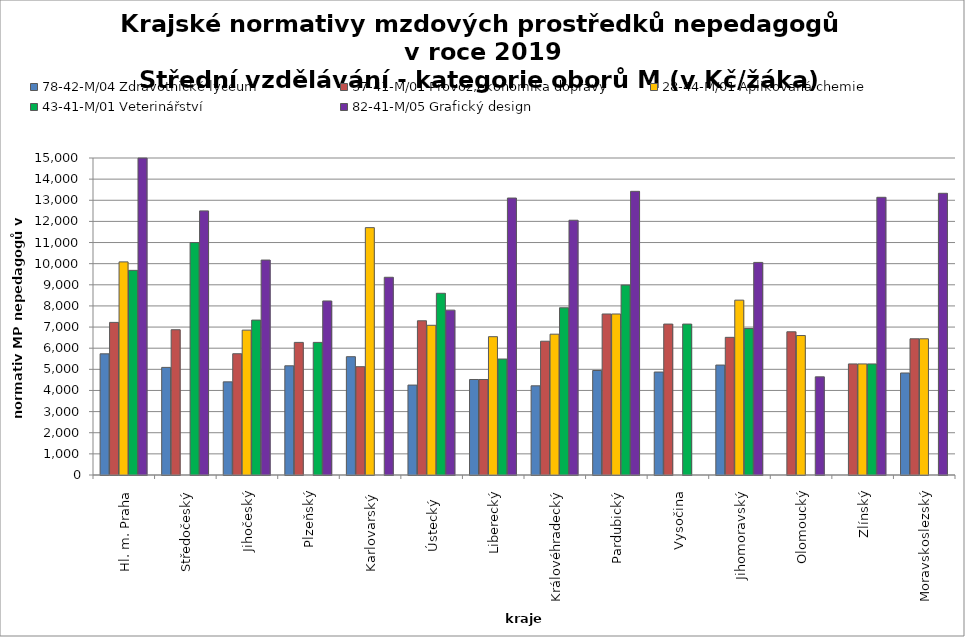
| Category | 78-42-M/04 Zdravotnické lyceum | 37-41-M/01 Provoz,ekonomika dopravy | 28-44-M/01 Aplikovaná chemie | 43-41-M/01 Veterinářství | 82-41-M/05 Grafický design |
|---|---|---|---|---|---|
| Hl. m. Praha | 5734.118 | 7220.741 | 10084.138 | 9683.444 | 14996.923 |
| Středočeský | 5091.778 | 6873.9 | 0 | 10998.24 | 12498 |
| Jihočeský | 4406.763 | 5738.106 | 6855.205 | 7330.318 | 10171.052 |
| Plzeňský | 5167.059 | 6274.286 | 0 | 6274.286 | 8235 |
| Karlovarský  | 5598.152 | 5124.736 | 11704.491 | 0 | 9355.822 |
| Ústecký   | 4255.418 | 7298.036 | 7083.777 | 8598.384 | 7801.6 |
| Liberecký | 4519.364 | 4519.364 | 6545.121 | 5488.154 | 13105.382 |
| Královéhradecký | 4220.1 | 6330.149 | 6663.315 | 7912.687 | 12054.571 |
| Pardubický | 4945.263 | 7618.378 | 7618.378 | 8985.655 | 13422.857 |
| Vysočina | 4872.046 | 7141.48 | 0 | 7141.48 | 0 |
| Jihomoravský | 5202.724 | 6513.88 | 8273.646 | 6930.847 | 10059.108 |
| Olomoucký | 0 | 6776.66 | 6599.214 | 0 | 4643.892 |
| Zlínský | 0 | 5256 | 5256 | 5256 | 13140 |
| Moravskoslezský | 4827.119 | 6445.059 | 6445.059 | 0 | 13329.173 |